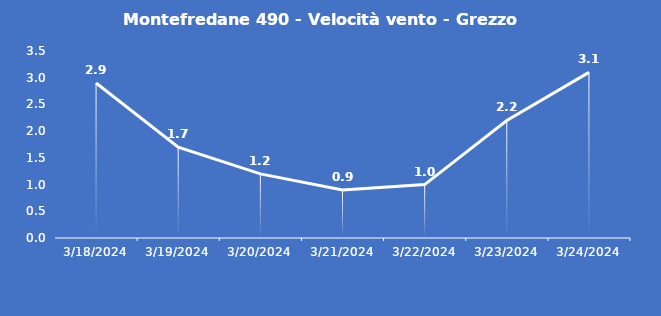
| Category | Montefredane 490 - Velocità vento - Grezzo (m/s) |
|---|---|
| 3/18/24 | 2.9 |
| 3/19/24 | 1.7 |
| 3/20/24 | 1.2 |
| 3/21/24 | 0.9 |
| 3/22/24 | 1 |
| 3/23/24 | 2.2 |
| 3/24/24 | 3.1 |